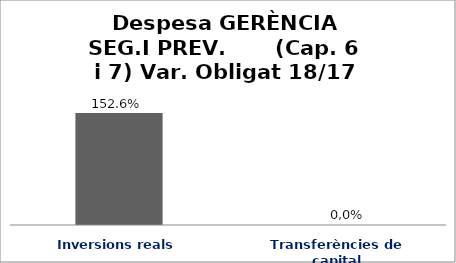
| Category | Series 0 |
|---|---|
| Inversions reals | 1.526 |
| Transferències de capital | 0 |